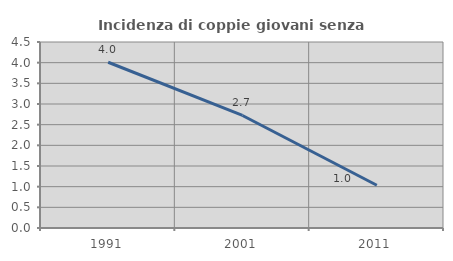
| Category | Incidenza di coppie giovani senza figli |
|---|---|
| 1991.0 | 4.01 |
| 2001.0 | 2.723 |
| 2011.0 | 1.034 |